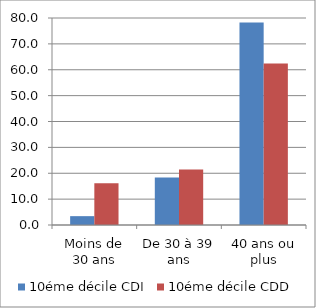
| Category | 10éme décile CDI | 10éme décile CDD |
|---|---|---|
| Moins de 30 ans | 3.421 | 16.119 |
| De 30 à 39 ans | 18.344 | 21.453 |
| 40 ans ou plus | 78.236 | 62.428 |